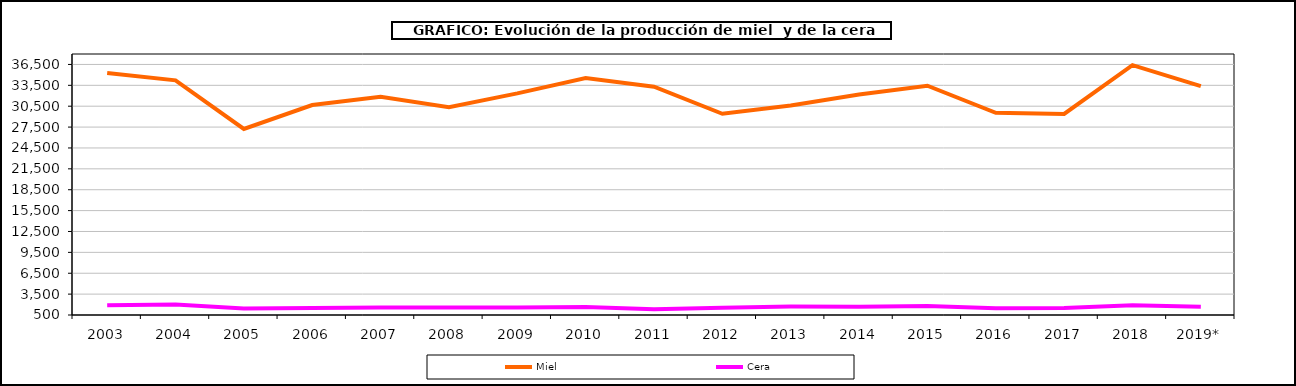
| Category | Miel | Cera |
|---|---|---|
| 2003 | 35278.604 | 1890.282 |
| 2004 | 34211.281 | 2012.912 |
| 2005 | 27229.804 | 1449.87 |
| 2006 | 30661.002 | 1522.368 |
| 2007 | 31840.043 | 1567.556 |
| 2008 | 30361.319 | 1574.535 |
| 2009 | 32336.448 | 1577.669 |
| 2010 | 34550 | 1649 |
| 2011 | 33298.2 | 1325.9 |
| 2012 | 29405 | 1533.9 |
| 2013 | 30612.761 | 1711.558 |
| 2014 | 32174.268 | 1688.302 |
| 2015 | 33440.771 | 1801.65 |
| 2016 | 29545.284 | 1472.699 |
| 2017 | 29393.153 | 1519.363 |
| 2018 | 36393.995 | 1903.773 |
| 2019* | 33375.917 | 1667.649 |